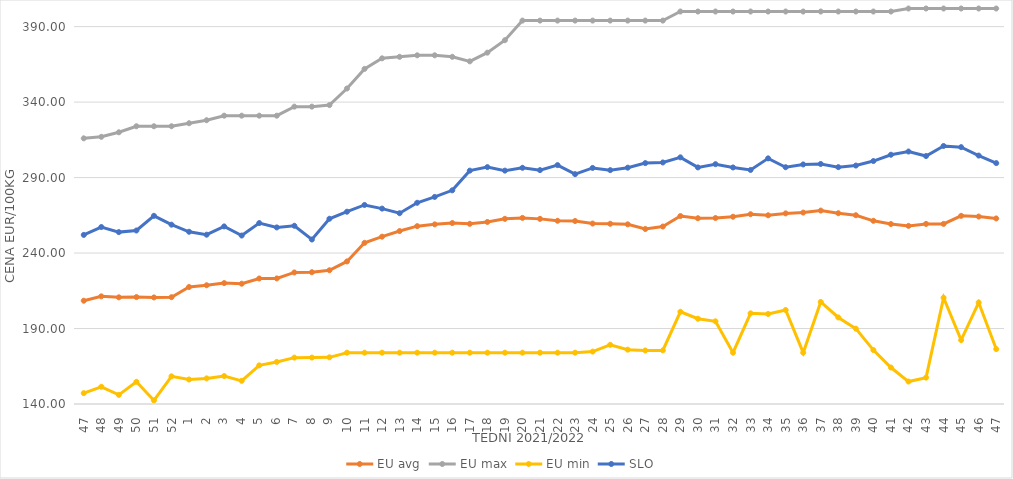
| Category | EU avg | EU max | EU min | SLO |
|---|---|---|---|---|
| 47.0 | 208.415 | 316 | 147.192 | 252.01 |
| 48.0 | 211.314 | 317 | 151.41 | 257.25 |
| 49.0 | 210.677 | 320 | 146.064 | 253.87 |
| 50.0 | 210.823 | 324 | 154.698 | 254.94 |
| 51.0 | 210.59 | 324 | 142.382 | 264.65 |
| 52.0 | 210.763 | 324 | 158.333 | 258.8 |
| 1.0 | 217.519 | 326 | 156.222 | 254.09 |
| 2.0 | 218.654 | 328 | 156.969 | 252.15 |
| 3.0 | 220.098 | 331 | 158.511 | 257.65 |
| 4.0 | 219.685 | 331 | 155.346 | 251.6 |
| 5.0 | 223.143 | 331 | 165.59 | 259.87 |
| 6.0 | 223.178 | 331 | 167.86 | 256.97 |
| 7.0 | 227.145 | 337 | 170.719 | 258.07 |
| 8.0 | 227.312 | 337 | 170.743 | 248.97 |
| 9.0 | 228.588 | 338 | 170.92 | 262.72 |
| 10.0 | 234.434 | 349 | 174 | 267.38 |
| 11.0 | 246.762 | 362 | 174 | 271.86 |
| 12.0 | 250.845 | 369 | 174 | 269.43 |
| 13.0 | 254.568 | 370 | 174 | 266.39 |
| 14.0 | 257.819 | 371 | 174 | 273.3 |
| 15.0 | 259 | 371 | 174 | 277.18 |
| 16.0 | 259.873 | 370 | 174 | 281.55 |
| 17.0 | 259.351 | 367 | 174 | 294.59 |
| 18.0 | 260.6 | 372.758 | 174 | 296.93 |
| 19.0 | 262.669 | 381 | 174 | 294.6 |
| 20.0 | 263.291 | 394 | 174 | 296.48 |
| 21.0 | 262.64 | 394 | 174 | 294.94 |
| 22.0 | 261.388 | 394 | 174 | 298.26 |
| 23.0 | 261.228 | 394 | 174 | 292.27 |
| 24.0 | 259.544 | 394 | 174.72 | 296.39 |
| 25.0 | 259.395 | 394 | 179.2 | 294.93 |
| 26.0 | 259.018 | 394 | 176 | 296.56 |
| 27.0 | 255.922 | 394 | 175.451 | 299.59 |
| 28.0 | 257.564 | 394 | 175.52 | 300.01 |
| 29.0 | 264.52 | 400 | 201.097 | 303.41 |
| 30.0 | 263.067 | 400 | 196.496 | 296.73 |
| 31.0 | 263.196 | 400 | 194.756 | 298.88 |
| 32.0 | 264.059 | 400 | 174 | 296.7 |
| 33.0 | 265.729 | 400 | 200.07 | 295.05 |
| 34.0 | 265.016 | 400 | 199.637 | 302.73 |
| 35.0 | 266.273 | 400 | 202.277 | 296.86 |
| 36.0 | 266.807 | 400 | 174 | 298.7 |
| 37.0 | 268.136 | 400 | 207.594 | 299.02 |
| 38.0 | 266.39 | 400 | 197.352 | 296.91 |
| 39.0 | 265.059 | 400 | 189.926 | 297.96 |
| 40.0 | 261.35 | 400 | 175.723 | 300.95 |
| 41.0 | 259.216 | 400 | 164.165 | 305.13 |
| 42.0 | 258.007 | 402 | 154.869 | 307.26 |
| 43.0 | 259.298 | 402 | 157.459 | 304.27 |
| 44.0 | 259.315 | 402 | 210.415 | 310.93 |
| 45.0 | 264.644 | 402 | 182.35 | 310.16 |
| 46.0 | 264.186 | 402 | 207.247 | 304.58 |
| 47.0 | 262.92 | 402 | 176.378 | 299.59 |